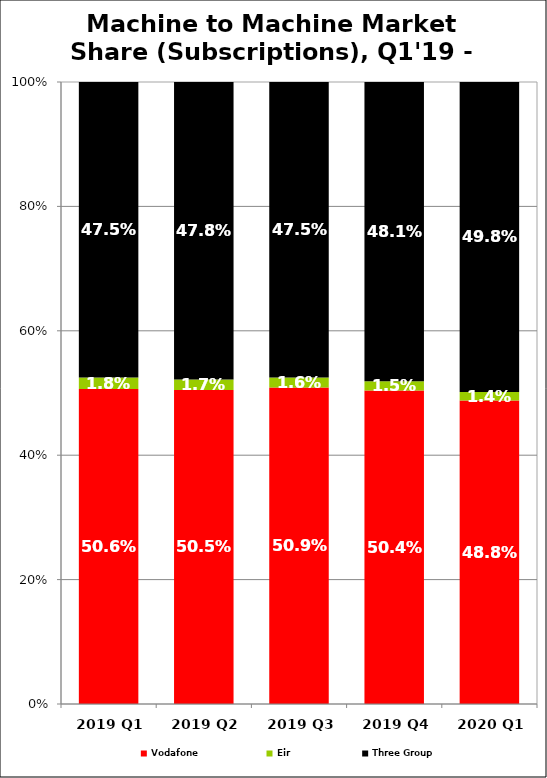
| Category | Vodafone | Eir  | Three Group |
|---|---|---|---|
| 2019 Q1 | 0.506 | 0.018 | 0.475 |
| 2019 Q2 | 0.505 | 0.017 | 0.478 |
| 2019 Q3 | 0.509 | 0.016 | 0.475 |
| 2019 Q4 | 0.504 | 0.015 | 0.481 |
| 2020 Q1 | 0.488 | 0.014 | 0.498 |